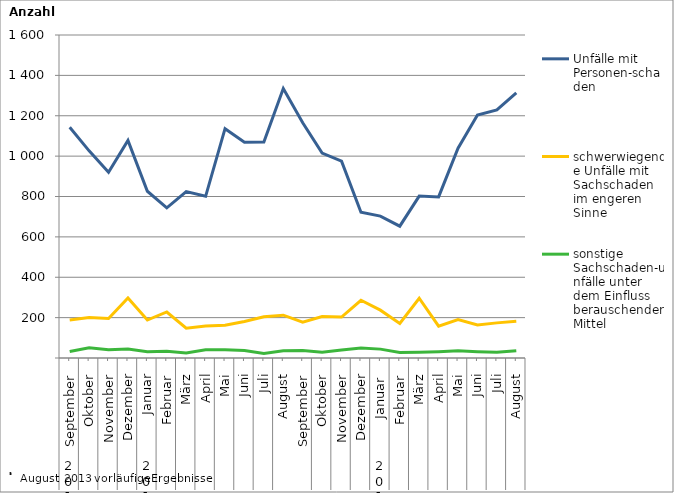
| Category | Unfälle mit Personen-schaden | schwerwiegende Unfälle mit Sachschaden   im engeren Sinne | sonstige Sachschaden-unfälle unter dem Einfluss berauschender Mittel |
|---|---|---|---|
| 0 | 1143 | 188 | 32 |
| 1 | 1026 | 200 | 51 |
| 2 | 920 | 196 | 41 |
| 3 | 1078 | 297 | 45 |
| 4 | 826 | 188 | 31 |
| 5 | 744 | 228 | 34 |
| 6 | 824 | 148 | 25 |
| 7 | 801 | 159 | 41 |
| 8 | 1136 | 162 | 41 |
| 9 | 1069 | 181 | 37 |
| 10 | 1070 | 204 | 22 |
| 11 | 1335 | 212 | 36 |
| 12 | 1165 | 177 | 37 |
| 13 | 1015 | 205 | 28 |
| 14 | 975 | 203 | 40 |
| 15 | 722 | 286 | 50 |
| 16 | 703 | 237 | 44 |
| 17 | 653 | 171 | 27 |
| 18 | 802 | 296 | 28 |
| 19 | 798 | 158 | 31 |
| 20 | 1039 | 190 | 36 |
| 21 | 1204 | 164 | 31 |
| 22 | 1229 | 174 | 28 |
| 23 | 1313 | 182 | 36 |